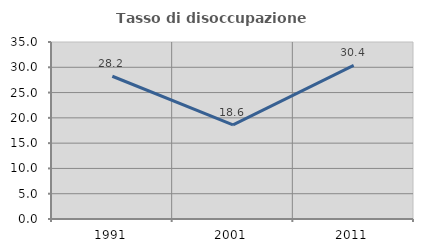
| Category | Tasso di disoccupazione giovanile  |
|---|---|
| 1991.0 | 28.23 |
| 2001.0 | 18.605 |
| 2011.0 | 30.392 |